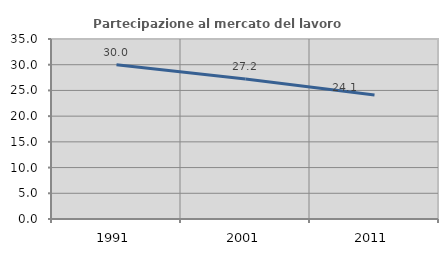
| Category | Partecipazione al mercato del lavoro  femminile |
|---|---|
| 1991.0 | 30.014 |
| 2001.0 | 27.201 |
| 2011.0 | 24.113 |